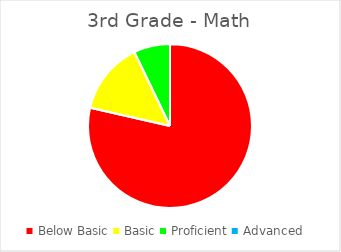
| Category | Series 0 |
|---|---|
| Below Basic | 0.786 |
| Basic | 0.143 |
| Proficient | 0.071 |
| Advanced | 0 |